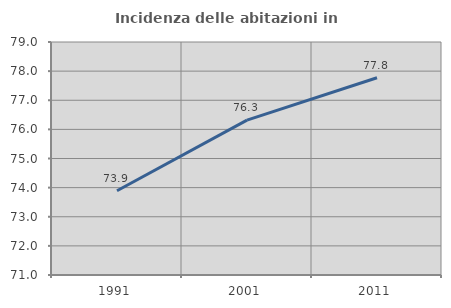
| Category | Incidenza delle abitazioni in proprietà  |
|---|---|
| 1991.0 | 73.891 |
| 2001.0 | 76.318 |
| 2011.0 | 77.771 |